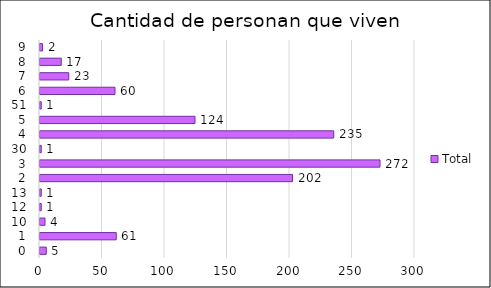
| Category | Total |
|---|---|
| 0 | 5 |
| 1 | 61 |
| 10 | 4 |
| 12 | 1 |
| 13 | 1 |
| 2 | 202 |
| 3 | 272 |
| 30 | 1 |
| 4 | 235 |
| 5 | 124 |
| 51 | 1 |
| 6 | 60 |
| 7 | 23 |
| 8 | 17 |
| 9 | 2 |